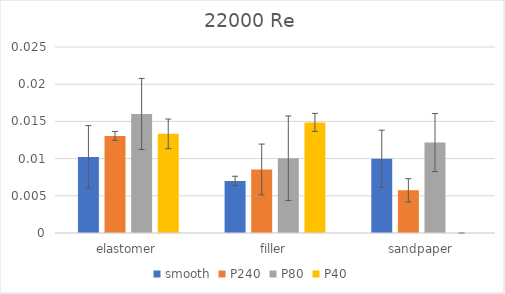
| Category | smooth | P240 | P80 | P40 |
|---|---|---|---|---|
| elastomer | 0.01 | 0.013 | 0.016 | 0.013 |
| filler | 0.007 | 0.009 | 0.01 | 0.015 |
| sandpaper | 0.01 | 0.006 | 0.012 | 0 |